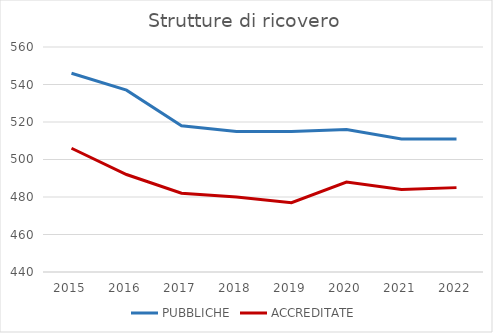
| Category | PUBBLICHE | ACCREDITATE |
|---|---|---|
| 2015.0 | 546 | 506 |
| 2016.0 | 537 | 492 |
| 2017.0 | 518 | 482 |
| 2018.0 | 515 | 480 |
| 2019.0 | 515 | 477 |
| 2020.0 | 516 | 488 |
| 2021.0 | 511 | 484 |
| 2022.0 | 511 | 485 |